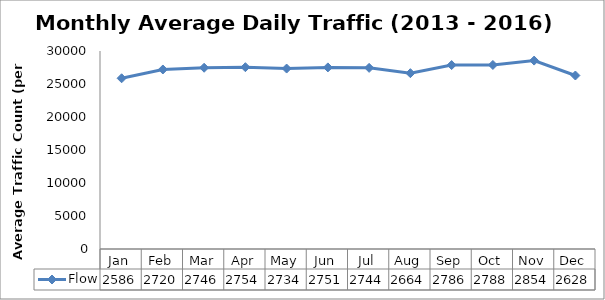
| Category | Flow |
|---|---|
| Jan | 25868 |
| Feb | 27201 |
| Mar | 27462.75 |
| Apr | 27548.25 |
| May | 27340.25 |
| Jun | 27516.5 |
| Jul | 27444.75 |
| Aug | 26642.25 |
| Sep | 27868 |
| Oct | 27885.5 |
| Nov | 28548 |
| Dec | 26287 |